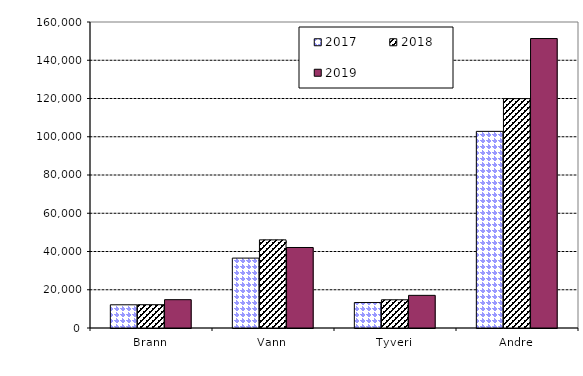
| Category | 2017 | 2018 | 2019 |
|---|---|---|---|
| Brann | 12131.619 | 12186.599 | 14807.767 |
| Vann | 36546.509 | 46084.437 | 42098.168 |
| Tyveri | 13316.301 | 14752.684 | 17067.714 |
| Andre | 102813.999 | 119937.321 | 151351.72 |